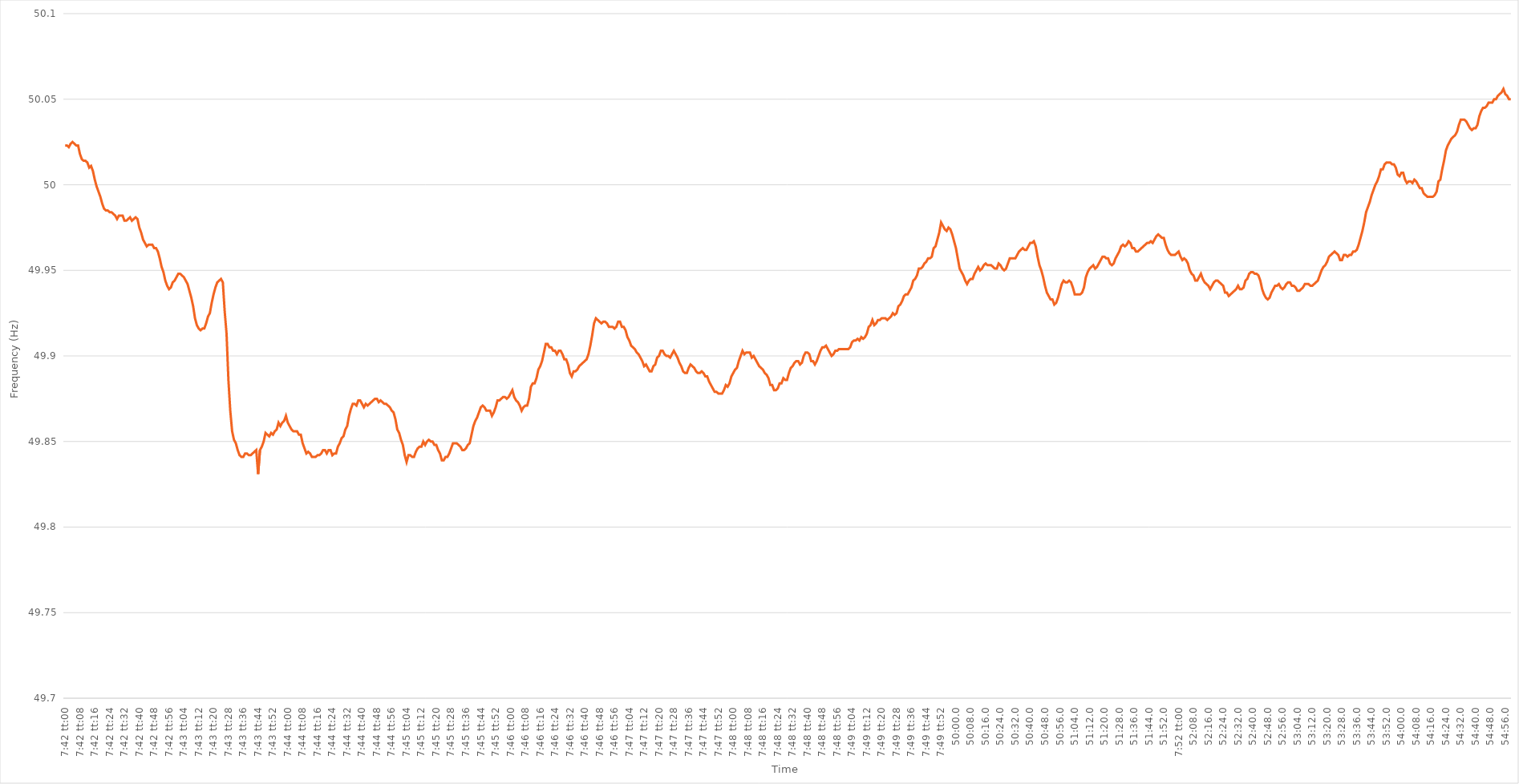
| Category | Series 0 |
|---|---|
| 0.32083333333333336 | 50.023 |
| 0.3208449074074074 | 50.023 |
| 0.3208564814814815 | 50.022 |
| 0.3208680555555556 | 50.024 |
| 0.3208796296296296 | 50.025 |
| 0.3208912037037037 | 50.024 |
| 0.32090277777777776 | 50.023 |
| 0.32091435185185185 | 50.023 |
| 0.3209259259259259 | 50.018 |
| 0.3209375 | 50.015 |
| 0.3209490740740741 | 50.014 |
| 0.3209606481481481 | 50.014 |
| 0.3209722222222222 | 50.013 |
| 0.3209837962962963 | 50.01 |
| 0.32099537037037035 | 50.011 |
| 0.32100694444444444 | 50.008 |
| 0.32101851851851854 | 50.003 |
| 0.3210300925925926 | 49.999 |
| 0.32104166666666667 | 49.996 |
| 0.32105324074074076 | 49.993 |
| 0.3210648148148148 | 49.989 |
| 0.3210763888888889 | 49.986 |
| 0.321087962962963 | 49.985 |
| 0.32109953703703703 | 49.985 |
| 0.3211111111111111 | 49.984 |
| 0.32112268518518516 | 49.984 |
| 0.32113425925925926 | 49.983 |
| 0.3211458333333333 | 49.982 |
| 0.32115740740740745 | 49.98 |
| 0.3211689814814815 | 49.982 |
| 0.3211805555555555 | 49.982 |
| 0.3211921296296296 | 49.982 |
| 0.3212037037037037 | 49.979 |
| 0.32121527777777775 | 49.979 |
| 0.32122685185185185 | 49.98 |
| 0.32123842592592594 | 49.981 |
| 0.32125 | 49.979 |
| 0.3212615740740741 | 49.98 |
| 0.32127314814814817 | 49.981 |
| 0.3212847222222222 | 49.98 |
| 0.3212962962962963 | 49.975 |
| 0.3213078703703704 | 49.972 |
| 0.32131944444444444 | 49.968 |
| 0.32133101851851853 | 49.966 |
| 0.3213425925925926 | 49.964 |
| 0.32135416666666666 | 49.965 |
| 0.3213657407407407 | 49.965 |
| 0.32137731481481485 | 49.965 |
| 0.3213888888888889 | 49.963 |
| 0.321400462962963 | 49.963 |
| 0.321412037037037 | 49.961 |
| 0.3214236111111111 | 49.957 |
| 0.32143518518518516 | 49.952 |
| 0.32144675925925925 | 49.949 |
| 0.32145833333333335 | 49.944 |
| 0.3214699074074074 | 49.941 |
| 0.3214814814814815 | 49.939 |
| 0.3214930555555556 | 49.94 |
| 0.3215046296296296 | 49.943 |
| 0.3215162037037037 | 49.944 |
| 0.3215277777777778 | 49.946 |
| 0.32153935185185184 | 49.948 |
| 0.32155092592592593 | 49.948 |
| 0.32156250000000003 | 49.947 |
| 0.32157407407407407 | 49.946 |
| 0.32158564814814816 | 49.944 |
| 0.32159722222222226 | 49.942 |
| 0.3216087962962963 | 49.938 |
| 0.3216203703703704 | 49.934 |
| 0.32163194444444443 | 49.929 |
| 0.3216435185185185 | 49.922 |
| 0.32165509259259256 | 49.918 |
| 0.32166666666666666 | 49.916 |
| 0.32167824074074075 | 49.915 |
| 0.3216898148148148 | 49.916 |
| 0.3217013888888889 | 49.916 |
| 0.321712962962963 | 49.919 |
| 0.321724537037037 | 49.923 |
| 0.3217361111111111 | 49.925 |
| 0.3217476851851852 | 49.931 |
| 0.32175925925925924 | 49.936 |
| 0.32177083333333334 | 49.94 |
| 0.32178240740740743 | 49.943 |
| 0.3217939814814815 | 49.944 |
| 0.32180555555555557 | 49.945 |
| 0.32181712962962966 | 49.943 |
| 0.3218287037037037 | 49.926 |
| 0.3218402777777778 | 49.913 |
| 0.32185185185185183 | 49.886 |
| 0.32186342592592593 | 49.868 |
| 0.32187499999999997 | 49.856 |
| 0.32188657407407406 | 49.851 |
| 0.32189814814814816 | 49.849 |
| 0.3219097222222222 | 49.845 |
| 0.3219212962962963 | 49.842 |
| 0.3219328703703704 | 49.841 |
| 0.3219444444444444 | 49.841 |
| 0.3219560185185185 | 49.843 |
| 0.3219675925925926 | 49.843 |
| 0.32197916666666665 | 49.842 |
| 0.32199074074074074 | 49.842 |
| 0.32200231481481484 | 49.843 |
| 0.3220138888888889 | 49.844 |
| 0.32202546296296297 | 49.845 |
| 0.32203703703703707 | 49.831 |
| 0.3220486111111111 | 49.845 |
| 0.3220601851851852 | 49.847 |
| 0.32207175925925924 | 49.85 |
| 0.32208333333333333 | 49.855 |
| 0.32209490740740737 | 49.854 |
| 0.3221064814814815 | 49.853 |
| 0.32211805555555556 | 49.855 |
| 0.3221296296296296 | 49.854 |
| 0.3221412037037037 | 49.856 |
| 0.3221527777777778 | 49.857 |
| 0.3221643518518518 | 49.861 |
| 0.3221759259259259 | 49.859 |
| 0.3221875 | 49.861 |
| 0.32219907407407405 | 49.862 |
| 0.32221064814814815 | 49.865 |
| 0.32222222222222224 | 49.861 |
| 0.3222337962962963 | 49.859 |
| 0.3222453703703704 | 49.857 |
| 0.32225694444444447 | 49.856 |
| 0.3222685185185185 | 49.856 |
| 0.3222800925925926 | 49.856 |
| 0.3222916666666667 | 49.854 |
| 0.32230324074074074 | 49.854 |
| 0.3223148148148148 | 49.849 |
| 0.3223263888888889 | 49.846 |
| 0.32233796296296297 | 49.843 |
| 0.322349537037037 | 49.844 |
| 0.3223611111111111 | 49.843 |
| 0.3223726851851852 | 49.841 |
| 0.32238425925925923 | 49.841 |
| 0.3223958333333333 | 49.841 |
| 0.3224074074074074 | 49.842 |
| 0.32241898148148146 | 49.842 |
| 0.32243055555555555 | 49.843 |
| 0.32244212962962965 | 49.845 |
| 0.3224537037037037 | 49.845 |
| 0.3224652777777778 | 49.843 |
| 0.3224768518518519 | 49.845 |
| 0.3224884259259259 | 49.845 |
| 0.3225 | 49.842 |
| 0.3225115740740741 | 49.843 |
| 0.32252314814814814 | 49.843 |
| 0.32253472222222224 | 49.847 |
| 0.32254629629629633 | 49.849 |
| 0.32255787037037037 | 49.852 |
| 0.32256944444444446 | 49.853 |
| 0.3225810185185185 | 49.857 |
| 0.3225925925925926 | 49.859 |
| 0.32260416666666664 | 49.865 |
| 0.32261574074074073 | 49.869 |
| 0.3226273148148148 | 49.872 |
| 0.32263888888888886 | 49.872 |
| 0.32265046296296296 | 49.871 |
| 0.32266203703703705 | 49.874 |
| 0.3226736111111111 | 49.874 |
| 0.3226851851851852 | 49.872 |
| 0.3226967592592593 | 49.87 |
| 0.3227083333333333 | 49.872 |
| 0.3227199074074074 | 49.871 |
| 0.3227314814814815 | 49.872 |
| 0.32274305555555555 | 49.873 |
| 0.32275462962962964 | 49.874 |
| 0.32276620370370374 | 49.875 |
| 0.3227777777777778 | 49.875 |
| 0.32278935185185187 | 49.873 |
| 0.3228009259259259 | 49.874 |
| 0.3228125 | 49.873 |
| 0.32282407407407404 | 49.872 |
| 0.32283564814814814 | 49.872 |
| 0.32284722222222223 | 49.871 |
| 0.32285879629629627 | 49.87 |
| 0.32287037037037036 | 49.868 |
| 0.32288194444444446 | 49.867 |
| 0.3228935185185185 | 49.863 |
| 0.3229050925925926 | 49.857 |
| 0.3229166666666667 | 49.855 |
| 0.3229282407407407 | 49.851 |
| 0.3229398148148148 | 49.848 |
| 0.3229513888888889 | 49.842 |
| 0.32296296296296295 | 49.838 |
| 0.32297453703703705 | 49.842 |
| 0.32298611111111114 | 49.842 |
| 0.3229976851851852 | 49.841 |
| 0.3230092592592593 | 49.841 |
| 0.3230208333333333 | 49.844 |
| 0.3230324074074074 | 49.846 |
| 0.32304398148148145 | 49.847 |
| 0.3230555555555556 | 49.847 |
| 0.32306712962962963 | 49.85 |
| 0.3230787037037037 | 49.848 |
| 0.32309027777777777 | 49.85 |
| 0.32310185185185186 | 49.851 |
| 0.3231134259259259 | 49.85 |
| 0.323125 | 49.85 |
| 0.3231365740740741 | 49.848 |
| 0.32314814814814813 | 49.848 |
| 0.3231597222222222 | 49.845 |
| 0.3231712962962963 | 49.843 |
| 0.32318287037037036 | 49.839 |
| 0.32319444444444445 | 49.839 |
| 0.32320601851851855 | 49.841 |
| 0.3232175925925926 | 49.841 |
| 0.3232291666666667 | 49.843 |
| 0.3232407407407408 | 49.846 |
| 0.3232523148148148 | 49.849 |
| 0.32326388888888885 | 49.849 |
| 0.323275462962963 | 49.849 |
| 0.32328703703703704 | 49.848 |
| 0.3232986111111111 | 49.847 |
| 0.3233101851851852 | 49.845 |
| 0.32332175925925927 | 49.845 |
| 0.3233333333333333 | 49.846 |
| 0.3233449074074074 | 49.848 |
| 0.3233564814814815 | 49.849 |
| 0.32336805555555553 | 49.854 |
| 0.32337962962962963 | 49.859 |
| 0.3233912037037037 | 49.862 |
| 0.32340277777777776 | 49.864 |
| 0.32341435185185186 | 49.867 |
| 0.32342592592592595 | 49.87 |
| 0.3234375 | 49.871 |
| 0.3234490740740741 | 49.87 |
| 0.3234606481481482 | 49.868 |
| 0.3234722222222222 | 49.868 |
| 0.3234837962962963 | 49.868 |
| 0.3234953703703704 | 49.865 |
| 0.32350694444444444 | 49.867 |
| 0.32351851851851854 | 49.87 |
| 0.3235300925925926 | 49.874 |
| 0.32354166666666667 | 49.874 |
| 0.3235532407407407 | 49.875 |
| 0.3235648148148148 | 49.876 |
| 0.3235763888888889 | 49.876 |
| 0.32358796296296294 | 49.875 |
| 0.32359953703703703 | 49.876 |
| 0.3236111111111111 | 49.878 |
| 0.32362268518518517 | 49.88 |
| 0.32363425925925926 | 49.876 |
| 0.32364583333333335 | 49.874 |
| 0.3236574074074074 | 49.873 |
| 0.3236689814814815 | 49.871 |
| 0.3236805555555556 | 49.868 |
| 0.3236921296296296 | 49.87 |
| 0.3237037037037037 | 49.871 |
| 0.3237152777777778 | 49.871 |
| 0.32372685185185185 | 49.875 |
| 0.32373842592592594 | 49.882 |
| 0.32375 | 49.884 |
| 0.3237615740740741 | 49.884 |
| 0.3237731481481481 | 49.887 |
| 0.3237847222222222 | 49.892 |
| 0.3237962962962963 | 49.894 |
| 0.32380787037037034 | 49.897 |
| 0.32381944444444444 | 49.902 |
| 0.32383101851851853 | 49.907 |
| 0.32384259259259257 | 49.907 |
| 0.32385416666666667 | 49.905 |
| 0.32386574074074076 | 49.905 |
| 0.3238773148148148 | 49.903 |
| 0.3238888888888889 | 49.903 |
| 0.323900462962963 | 49.901 |
| 0.323912037037037 | 49.903 |
| 0.3239236111111111 | 49.903 |
| 0.3239351851851852 | 49.901 |
| 0.32394675925925925 | 49.898 |
| 0.32395833333333335 | 49.898 |
| 0.3239699074074074 | 49.895 |
| 0.3239814814814815 | 49.89 |
| 0.3239930555555555 | 49.888 |
| 0.32400462962962967 | 49.891 |
| 0.3240162037037037 | 49.891 |
| 0.32402777777777775 | 49.892 |
| 0.32403935185185184 | 49.894 |
| 0.32405092592592594 | 49.895 |
| 0.3240625 | 49.896 |
| 0.32407407407407407 | 49.897 |
| 0.32408564814814816 | 49.898 |
| 0.3240972222222222 | 49.901 |
| 0.3241087962962963 | 49.906 |
| 0.3241203703703704 | 49.912 |
| 0.32413194444444443 | 49.919 |
| 0.3241435185185185 | 49.922 |
| 0.3241550925925926 | 49.921 |
| 0.32416666666666666 | 49.92 |
| 0.32417824074074075 | 49.919 |
| 0.32418981481481485 | 49.92 |
| 0.3242013888888889 | 49.92 |
| 0.3242129629629629 | 49.919 |
| 0.3242245370370371 | 49.917 |
| 0.3242361111111111 | 49.917 |
| 0.32424768518518515 | 49.917 |
| 0.32425925925925925 | 49.916 |
| 0.32427083333333334 | 49.917 |
| 0.3242824074074074 | 49.92 |
| 0.3242939814814815 | 49.92 |
| 0.32430555555555557 | 49.917 |
| 0.3243171296296296 | 49.917 |
| 0.3243287037037037 | 49.915 |
| 0.3243402777777778 | 49.911 |
| 0.32435185185185184 | 49.909 |
| 0.32436342592592593 | 49.906 |
| 0.324375 | 49.905 |
| 0.32438657407407406 | 49.904 |
| 0.32439814814814816 | 49.902 |
| 0.32440972222222225 | 49.901 |
| 0.3244212962962963 | 49.899 |
| 0.32443287037037033 | 49.897 |
| 0.3244444444444445 | 49.894 |
| 0.3244560185185185 | 49.895 |
| 0.3244675925925926 | 49.893 |
| 0.32447916666666665 | 49.891 |
| 0.32449074074074075 | 49.891 |
| 0.3245023148148148 | 49.894 |
| 0.3245138888888889 | 49.895 |
| 0.324525462962963 | 49.899 |
| 0.324537037037037 | 49.9 |
| 0.3245486111111111 | 49.903 |
| 0.3245601851851852 | 49.903 |
| 0.32457175925925924 | 49.901 |
| 0.32458333333333333 | 49.9 |
| 0.32459490740740743 | 49.9 |
| 0.32460648148148147 | 49.899 |
| 0.32461805555555556 | 49.901 |
| 0.32462962962962966 | 49.903 |
| 0.3246412037037037 | 49.901 |
| 0.3246527777777778 | 49.899 |
| 0.3246643518518519 | 49.896 |
| 0.3246759259259259 | 49.894 |
| 0.3246875 | 49.891 |
| 0.32469907407407406 | 49.89 |
| 0.32471064814814815 | 49.89 |
| 0.3247222222222222 | 49.893 |
| 0.3247337962962963 | 49.895 |
| 0.3247453703703704 | 49.894 |
| 0.3247569444444444 | 49.893 |
| 0.3247685185185185 | 49.891 |
| 0.3247800925925926 | 49.89 |
| 0.32479166666666665 | 49.89 |
| 0.32480324074074074 | 49.891 |
| 0.32481481481481483 | 49.89 |
| 0.3248263888888889 | 49.888 |
| 0.32483796296296297 | 49.888 |
| 0.32484953703703706 | 49.885 |
| 0.3248611111111111 | 49.883 |
| 0.3248726851851852 | 49.881 |
| 0.3248842592592593 | 49.879 |
| 0.32489583333333333 | 49.879 |
| 0.3249074074074074 | 49.878 |
| 0.32491898148148146 | 49.878 |
| 0.32493055555555556 | 49.878 |
| 0.3249421296296296 | 49.88 |
| 0.3249537037037037 | 49.883 |
| 0.3249652777777778 | 49.882 |
| 0.3249768518518518 | 49.884 |
| 0.3249884259259259 | 49.888 |
| 0.325 | 49.89 |
| 0.32501157407407405 | 49.892 |
| 0.32502314814814814 | 49.893 |
| 0.32503472222222224 | 49.897 |
| 0.3250462962962963 | 49.9 |
| 0.32505787037037037 | 49.903 |
| 0.32506944444444447 | 49.901 |
| 0.3250810185185185 | 49.902 |
| 0.3250925925925926 | 49.902 |
| 0.3251041666666667 | 49.902 |
| 0.32511574074074073 | 49.899 |
| 0.3251273148148148 | 49.9 |
| 0.3251388888888889 | 49.898 |
| 0.32515046296296296 | 49.896 |
| 0.325162037037037 | 49.894 |
| 0.32517361111111115 | 49.893 |
| 0.3251851851851852 | 49.892 |
| 0.3251967592592592 | 49.89 |
| 0.3252083333333333 | 49.889 |
| 0.3252199074074074 | 49.887 |
| 0.32523148148148145 | 49.883 |
| 0.32524305555555555 | 49.883 |
| 0.32525462962962964 | 49.88 |
| 0.3252662037037037 | 49.88 |
| 0.3252777777777778 | 49.881 |
| 0.32528935185185187 | 49.884 |
| 0.3253009259259259 | 49.884 |
| 0.3253125 | 49.887 |
| 0.3253240740740741 | 49.886 |
| 0.32533564814814814 | 49.886 |
| 0.32534722222222223 | 49.89 |
| 0.3253587962962963 | 49.893 |
| 0.32537037037037037 | 49.894 |
| 0.3253819444444444 | 49.896 |
| 0.32539351851851855 | 49.897 |
| 0.3254050925925926 | 49.897 |
| 0.3254166666666667 | 49.895 |
| 0.3254282407407407 | 49.896 |
| 0.3254398148148148 | 49.9 |
| 0.32545138888888886 | 49.902 |
| 0.32546296296296295 | 49.902 |
| 0.32547453703703705 | 49.901 |
| 0.3254861111111111 | 49.897 |
| 0.3254976851851852 | 49.897 |
| 0.3255092592592593 | 49.895 |
| 0.3255208333333333 | 49.897 |
| 0.3255324074074074 | 49.9 |
| 0.3255439814814815 | 49.903 |
| 0.32555555555555554 | 49.905 |
| 0.32556712962962964 | 49.905 |
| 0.32557870370370373 | 49.906 |
| 0.32559027777777777 | 49.904 |
| 0.32560185185185186 | 49.902 |
| 0.32561342592592596 | 49.9 |
| 0.325625 | 49.901 |
| 0.3256365740740741 | 49.903 |
| 0.32564814814814813 | 49.903 |
| 0.3256597222222222 | 49.904 |
| 0.32567129629629626 | 49.904 |
| 0.32568287037037036 | 49.904 |
| 0.32569444444444445 | 49.904 |
| 0.3257060185185185 | 49.904 |
| 0.3257175925925926 | 49.904 |
| 0.3257291666666667 | 49.905 |
| 0.3257407407407407 | 49.908 |
| 0.3257523148148148 | 49.909 |
| 0.3257638888888889 | 49.909 |
| 0.32577546296296295 | 49.91 |
| 0.32578703703703704 | 49.909 |
| 0.32579861111111114 | 49.911 |
| 0.3258101851851852 | 49.91 |
| 0.32582175925925927 | 49.911 |
| 0.32583333333333336 | 49.913 |
| 0.3258449074074074 | 49.917 |
| 0.3258564814814815 | 49.918 |
| 0.32586805555555554 | 49.921 |
| 0.32587962962962963 | 49.918 |
| 0.32589120370370367 | 49.919 |
| 0.32590277777777776 | 49.921 |
| 0.32591435185185186 | 49.921 |
| 0.3259259259259259 | 49.922 |
| 0.3259375 | 49.922 |
| 0.3259490740740741 | 49.922 |
| 0.3259606481481481 | 49.921 |
| 0.3259722222222222 | 49.922 |
| 0.3259837962962963 | 49.923 |
| 0.32599537037037035 | 49.925 |
| 0.32600694444444445 | 49.924 |
| 0.32601851851851854 | 49.925 |
| 0.3260300925925926 | 49.929 |
| 0.3260416666666667 | 49.93 |
| 0.32605324074074077 | 49.932 |
| 0.3260648148148148 | 49.935 |
| 0.3260763888888889 | 49.936 |
| 0.326087962962963 | 49.936 |
| 0.32609953703703703 | 49.938 |
| 0.3261111111111111 | 49.94 |
| 0.3261226851851852 | 49.944 |
| 0.32613425925925926 | 49.945 |
| 0.3261458333333333 | 49.947 |
| 0.3261574074074074 | 49.951 |
| 0.3261689814814815 | 49.951 |
| 0.32618055555555553 | 49.952 |
| 0.3261921296296296 | 49.954 |
| 0.3262037037037037 | 49.955 |
| 0.32621527777777776 | 49.957 |
| 0.32622685185185185 | 49.957 |
| 0.32623842592592595 | 49.958 |
| 0.32625 | 49.963 |
| 0.3262615740740741 | 49.964 |
| 0.3262731481481482 | 49.968 |
| 0.3262847222222222 | 49.972 |
| 0.3262962962962963 | 49.978 |
| 0.3263078703703704 | 49.976 |
| 0.32631944444444444 | 49.974 |
| 0.3263310185185185 | 49.973 |
| 0.32634259259259263 | 49.975 |
| 0.32635416666666667 | 49.974 |
| 0.32636574074074076 | 49.971 |
| 0.3263773148148148 | 49.967 |
| 0.3263888888888889 | 49.963 |
| 0.32640046296296293 | 49.957 |
| 0.32641203703703703 | 49.951 |
| 0.3264236111111111 | 49.949 |
| 0.32643518518518516 | 49.947 |
| 0.32644675925925926 | 49.944 |
| 0.32645833333333335 | 49.942 |
| 0.3264699074074074 | 49.944 |
| 0.3264814814814815 | 49.945 |
| 0.3264930555555556 | 49.945 |
| 0.3265046296296296 | 49.948 |
| 0.3265162037037037 | 49.95 |
| 0.3265277777777778 | 49.952 |
| 0.32653935185185184 | 49.95 |
| 0.32655092592592594 | 49.951 |
| 0.32656250000000003 | 49.953 |
| 0.32657407407407407 | 49.954 |
| 0.32658564814814817 | 49.953 |
| 0.3265972222222222 | 49.953 |
| 0.3266087962962963 | 49.953 |
| 0.32662037037037034 | 49.952 |
| 0.32663194444444443 | 49.951 |
| 0.3266435185185185 | 49.951 |
| 0.32665509259259257 | 49.954 |
| 0.32666666666666666 | 49.953 |
| 0.32667824074074076 | 49.951 |
| 0.3266898148148148 | 49.95 |
| 0.3267013888888889 | 49.951 |
| 0.326712962962963 | 49.954 |
| 0.326724537037037 | 49.957 |
| 0.3267361111111111 | 49.957 |
| 0.3267476851851852 | 49.957 |
| 0.32675925925925925 | 49.957 |
| 0.32677083333333334 | 49.959 |
| 0.32678240740740744 | 49.961 |
| 0.3267939814814815 | 49.962 |
| 0.32680555555555557 | 49.963 |
| 0.3268171296296296 | 49.962 |
| 0.3268287037037037 | 49.962 |
| 0.32684027777777774 | 49.964 |
| 0.32685185185185184 | 49.966 |
| 0.32686342592592593 | 49.966 |
| 0.32687499999999997 | 49.967 |
| 0.32688657407407407 | 49.964 |
| 0.32689814814814816 | 49.958 |
| 0.3269097222222222 | 49.953 |
| 0.3269212962962963 | 49.95 |
| 0.3269328703703704 | 49.946 |
| 0.3269444444444444 | 49.941 |
| 0.3269560185185185 | 49.937 |
| 0.3269675925925926 | 49.935 |
| 0.32697916666666665 | 49.933 |
| 0.32699074074074075 | 49.933 |
| 0.32700231481481484 | 49.93 |
| 0.3270138888888889 | 49.931 |
| 0.327025462962963 | 49.934 |
| 0.327037037037037 | 49.938 |
| 0.3270486111111111 | 49.942 |
| 0.32706018518518515 | 49.944 |
| 0.3270717592592593 | 49.943 |
| 0.32708333333333334 | 49.943 |
| 0.3270949074074074 | 49.944 |
| 0.32710648148148147 | 49.943 |
| 0.32711805555555556 | 49.94 |
| 0.3271296296296296 | 49.936 |
| 0.3271412037037037 | 49.936 |
| 0.3271527777777778 | 49.936 |
| 0.32716435185185183 | 49.936 |
| 0.3271759259259259 | 49.937 |
| 0.3271875 | 49.94 |
| 0.32719907407407406 | 49.946 |
| 0.32721064814814815 | 49.949 |
| 0.32722222222222225 | 49.951 |
| 0.3272337962962963 | 49.952 |
| 0.3272453703703704 | 49.953 |
| 0.3272569444444445 | 49.951 |
| 0.3272685185185185 | 49.952 |
| 0.32728009259259255 | 49.954 |
| 0.3272916666666667 | 49.956 |
| 0.32730324074074074 | 49.958 |
| 0.32731481481481484 | 49.958 |
| 0.3273263888888889 | 49.957 |
| 0.32733796296296297 | 49.957 |
| 0.327349537037037 | 49.954 |
| 0.3273611111111111 | 49.953 |
| 0.3273726851851852 | 49.954 |
| 0.32738425925925924 | 49.957 |
| 0.32739583333333333 | 49.959 |
| 0.3274074074074074 | 49.961 |
| 0.32741898148148146 | 49.964 |
| 0.32743055555555556 | 49.965 |
| 0.32744212962962965 | 49.964 |
| 0.3274537037037037 | 49.965 |
| 0.3274652777777778 | 49.967 |
| 0.3274768518518519 | 49.966 |
| 0.3274884259259259 | 49.963 |
| 0.3275 | 49.963 |
| 0.3275115740740741 | 49.961 |
| 0.32752314814814815 | 49.961 |
| 0.32753472222222224 | 49.962 |
| 0.3275462962962963 | 49.963 |
| 0.3275578703703704 | 49.964 |
| 0.3275694444444444 | 49.965 |
| 0.3275810185185185 | 49.966 |
| 0.3275925925925926 | 49.966 |
| 0.32760416666666664 | 49.967 |
| 0.32761574074074074 | 49.966 |
| 0.32762731481481483 | 49.968 |
| 0.32763888888888887 | 49.97 |
| 0.32765046296296296 | 49.971 |
| 0.32766203703703706 | 49.97 |
| 0.3276736111111111 | 49.969 |
| 0.3276851851851852 | 49.969 |
| 0.3276967592592593 | 49.965 |
| 0.3277083333333333 | 49.962 |
| 0.3277199074074074 | 49.96 |
| 0.3277314814814815 | 49.959 |
| 0.32774305555555555 | 49.959 |
| 0.32775462962962965 | 49.959 |
| 0.3277662037037037 | 49.96 |
| 0.3277777777777778 | 49.961 |
| 0.3277893518518518 | 49.958 |
| 0.3278009259259259 | 49.956 |
| 0.3278125 | 49.957 |
| 0.32782407407407405 | 49.956 |
| 0.32783564814814814 | 49.954 |
| 0.32784722222222223 | 49.95 |
| 0.3278587962962963 | 49.948 |
| 0.32787037037037037 | 49.947 |
| 0.32788194444444446 | 49.944 |
| 0.3278935185185185 | 49.944 |
| 0.3279050925925926 | 49.946 |
| 0.3279166666666667 | 49.948 |
| 0.32792824074074073 | 49.945 |
| 0.3279398148148148 | 49.943 |
| 0.3279513888888889 | 49.942 |
| 0.32796296296296296 | 49.941 |
| 0.32797453703703705 | 49.939 |
| 0.3279861111111111 | 49.941 |
| 0.3279976851851852 | 49.943 |
| 0.3280092592592592 | 49.944 |
| 0.3280208333333334 | 49.944 |
| 0.3280324074074074 | 49.943 |
| 0.32804398148148145 | 49.942 |
| 0.32805555555555554 | 49.941 |
| 0.32806712962962964 | 49.937 |
| 0.3280787037037037 | 49.937 |
| 0.3280902777777778 | 49.935 |
| 0.32810185185185187 | 49.936 |
| 0.3281134259259259 | 49.937 |
| 0.328125 | 49.938 |
| 0.3281365740740741 | 49.939 |
| 0.32814814814814813 | 49.941 |
| 0.3281597222222222 | 49.939 |
| 0.3281712962962963 | 49.939 |
| 0.32818287037037036 | 49.94 |
| 0.32819444444444446 | 49.944 |
| 0.32820601851851855 | 49.945 |
| 0.3282175925925926 | 49.948 |
| 0.3282291666666666 | 49.949 |
| 0.3282407407407408 | 49.949 |
| 0.3282523148148148 | 49.948 |
| 0.3282638888888889 | 49.948 |
| 0.32827546296296295 | 49.947 |
| 0.32828703703703704 | 49.944 |
| 0.3282986111111111 | 49.939 |
| 0.3283101851851852 | 49.936 |
| 0.32832175925925927 | 49.934 |
| 0.3283333333333333 | 49.933 |
| 0.3283449074074074 | 49.934 |
| 0.3283564814814815 | 49.937 |
| 0.32836805555555554 | 49.939 |
| 0.32837962962962963 | 49.941 |
| 0.3283912037037037 | 49.941 |
| 0.32840277777777777 | 49.942 |
| 0.32841435185185186 | 49.94 |
| 0.32842592592592595 | 49.939 |
| 0.3284375 | 49.94 |
| 0.3284490740740741 | 49.942 |
| 0.3284606481481482 | 49.943 |
| 0.3284722222222222 | 49.943 |
| 0.3284837962962963 | 49.941 |
| 0.32849537037037035 | 49.941 |
| 0.32850694444444445 | 49.94 |
| 0.3285185185185185 | 49.938 |
| 0.3285300925925926 | 49.938 |
| 0.3285416666666667 | 49.939 |
| 0.3285532407407407 | 49.94 |
| 0.3285648148148148 | 49.942 |
| 0.3285763888888889 | 49.942 |
| 0.32858796296296294 | 49.942 |
| 0.32859953703703704 | 49.941 |
| 0.32861111111111113 | 49.941 |
| 0.32862268518518517 | 49.942 |
| 0.32863425925925926 | 49.943 |
| 0.32864583333333336 | 49.944 |
| 0.3286574074074074 | 49.947 |
| 0.3286689814814815 | 49.95 |
| 0.3286805555555556 | 49.952 |
| 0.3286921296296296 | 49.953 |
| 0.3287037037037037 | 49.955 |
| 0.32871527777777776 | 49.958 |
| 0.32872685185185185 | 49.959 |
| 0.3287384259259259 | 49.96 |
| 0.32875 | 49.961 |
| 0.3287615740740741 | 49.96 |
| 0.3287731481481481 | 49.959 |
| 0.3287847222222222 | 49.956 |
| 0.3287962962962963 | 49.956 |
| 0.32880787037037035 | 49.959 |
| 0.32881944444444444 | 49.959 |
| 0.32883101851851854 | 49.958 |
| 0.3288425925925926 | 49.959 |
| 0.32885416666666667 | 49.959 |
| 0.32886574074074076 | 49.961 |
| 0.3288773148148148 | 49.961 |
| 0.3288888888888889 | 49.962 |
| 0.328900462962963 | 49.965 |
| 0.32891203703703703 | 49.969 |
| 0.3289236111111111 | 49.973 |
| 0.32893518518518516 | 49.978 |
| 0.32894675925925926 | 49.984 |
| 0.3289583333333333 | 49.987 |
| 0.32896990740740745 | 49.99 |
| 0.3289814814814815 | 49.994 |
| 0.3289930555555555 | 49.997 |
| 0.3290046296296296 | 50 |
| 0.3290162037037037 | 50.002 |
| 0.32902777777777775 | 50.005 |
| 0.32903935185185185 | 50.009 |
| 0.32905092592592594 | 50.009 |
| 0.3290625 | 50.012 |
| 0.3290740740740741 | 50.013 |
| 0.32908564814814817 | 50.013 |
| 0.3290972222222222 | 50.013 |
| 0.3291087962962963 | 50.012 |
| 0.3291203703703704 | 50.012 |
| 0.32913194444444444 | 50.01 |
| 0.32914351851851853 | 50.006 |
| 0.3291550925925926 | 50.005 |
| 0.32916666666666666 | 50.007 |
| 0.3291782407407407 | 50.007 |
| 0.32918981481481485 | 50.003 |
| 0.3292013888888889 | 50.001 |
| 0.329212962962963 | 50.002 |
| 0.329224537037037 | 50.002 |
| 0.3292361111111111 | 50.001 |
| 0.32924768518518516 | 50.003 |
| 0.32925925925925925 | 50.002 |
| 0.32927083333333335 | 50 |
| 0.3292824074074074 | 49.998 |
| 0.3292939814814815 | 49.998 |
| 0.3293055555555556 | 49.995 |
| 0.3293171296296296 | 49.994 |
| 0.3293287037037037 | 49.993 |
| 0.3293402777777778 | 49.993 |
| 0.32935185185185184 | 49.993 |
| 0.32936342592592593 | 49.993 |
| 0.32937500000000003 | 49.994 |
| 0.32938657407407407 | 49.996 |
| 0.32939814814814816 | 50.002 |
| 0.32940972222222226 | 50.003 |
| 0.3294212962962963 | 50.009 |
| 0.3294328703703704 | 50.014 |
| 0.32944444444444443 | 50.02 |
| 0.3294560185185185 | 50.023 |
| 0.32946759259259256 | 50.025 |
| 0.32947916666666666 | 50.027 |
| 0.32949074074074075 | 50.028 |
| 0.3295023148148148 | 50.029 |
| 0.3295138888888889 | 50.031 |
| 0.329525462962963 | 50.035 |
| 0.329537037037037 | 50.038 |
| 0.3295486111111111 | 50.038 |
| 0.3295601851851852 | 50.038 |
| 0.32957175925925924 | 50.037 |
| 0.32958333333333334 | 50.035 |
| 0.32959490740740743 | 50.033 |
| 0.3296064814814815 | 50.032 |
| 0.32961805555555557 | 50.033 |
| 0.32962962962962966 | 50.033 |
| 0.3296412037037037 | 50.035 |
| 0.3296527777777778 | 50.04 |
| 0.32966435185185183 | 50.043 |
| 0.32967592592592593 | 50.045 |
| 0.32968749999999997 | 50.045 |
| 0.32969907407407406 | 50.046 |
| 0.32971064814814816 | 50.048 |
| 0.3297222222222222 | 50.048 |
| 0.3297337962962963 | 50.048 |
| 0.3297453703703704 | 50.05 |
| 0.3297569444444444 | 50.05 |
| 0.3297685185185185 | 50.052 |
| 0.3297800925925926 | 50.053 |
| 0.32979166666666665 | 50.054 |
| 0.32980324074074074 | 50.056 |
| 0.32981481481481484 | 50.053 |
| 0.3298263888888889 | 50.052 |
| 0.32983796296296297 | 50.05 |
| 0.32984953703703707 | 50.05 |